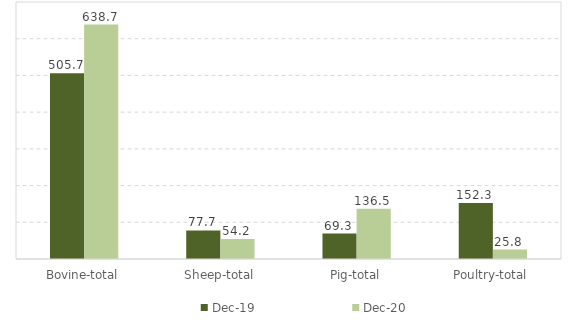
| Category | Dec-19 | Dec-20 |
|---|---|---|
| Bovine-total | 505.7 | 638.694 |
| Sheep-total | 77.7 | 54.231 |
| Pig-total | 69.3 | 136.532 |
| Poultry-total | 152.3 | 25.763 |